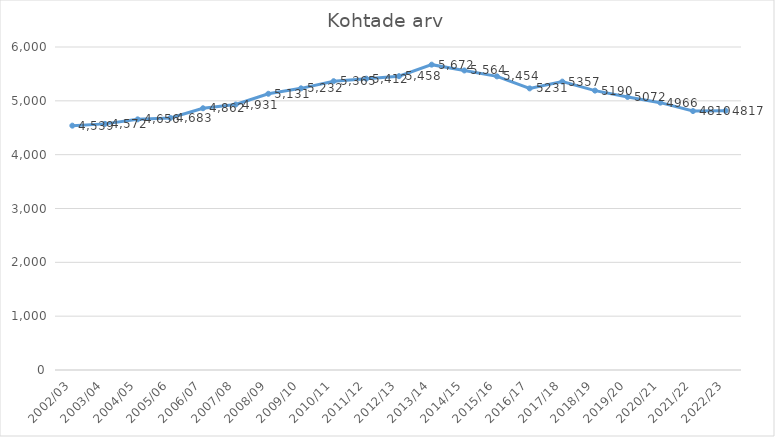
| Category | Kohtade arv |
|---|---|
| 2002/03 | 4539 |
| 2003/04 | 4572 |
| 2004/05 | 4656 |
| 2005/06 | 4683 |
| 2006/07 | 4862 |
| 2007/08 | 4931 |
| 2008/09 | 5131 |
| 2009/10 | 5232 |
| 2010/11 | 5365 |
| 2011/12 | 5412 |
| 2012/13 | 5458 |
| 2013/14 | 5672 |
| 2014/15 | 5564 |
| 2015/16 | 5454 |
| 2016/17 | 5231 |
| 2017/18 | 5357 |
| 2018/19 | 5190 |
| 2019/20 | 5072 |
| 2020/21 | 4966 |
| 2021/22 | 4810 |
| 2022/23 | 4817 |